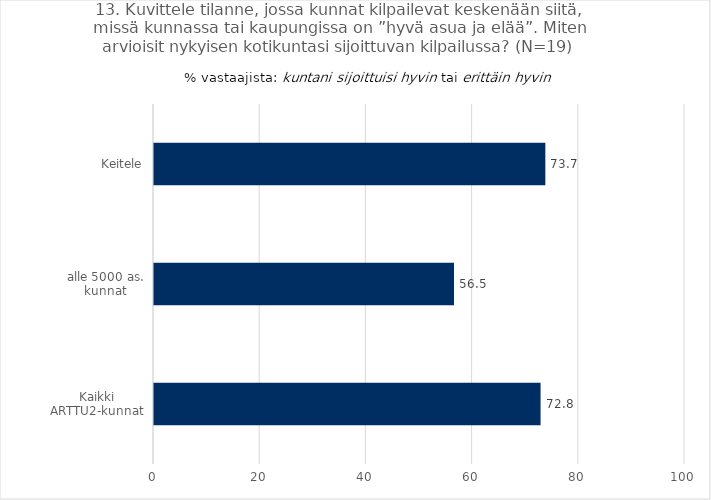
| Category | Kuvittele tilanne, jossa kunnat kilpailevat keskenään siitä, missä kunnassa tai kaupungissa on ”hyvä asua ja elää”. Miten arvioisit nykyisen kotikuntasi sijoittuvan kilpailussa?  |
|---|---|
| Kaikki ARTTU2-kunnat | 72.8 |
| alle 5000 as. kunnat | 56.5 |
| Keitele | 73.7 |